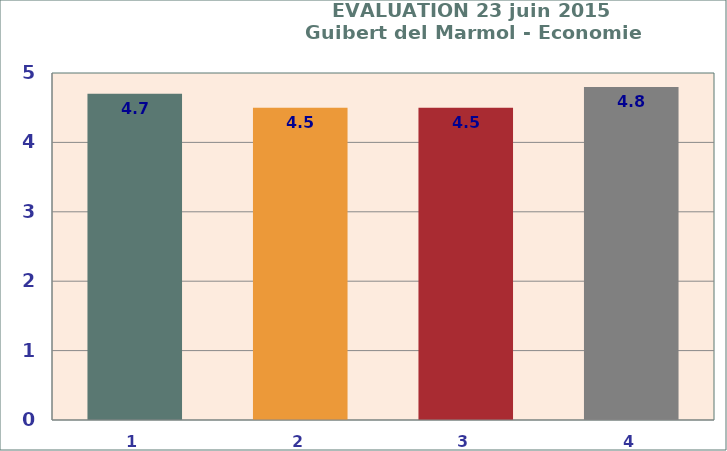
| Category | Series 0 |
|---|---|
| 0 | 4.7 |
| 1 | 4.5 |
| 2 | 4.5 |
| 3 | 4.8 |